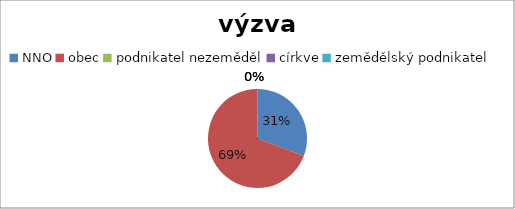
| Category | Series 0 |
|---|---|
| NNO | 4 |
| obec | 9 |
| podnikatel nezeměděl | 0 |
| církve | 0 |
| zemědělský podnikatel | 0 |